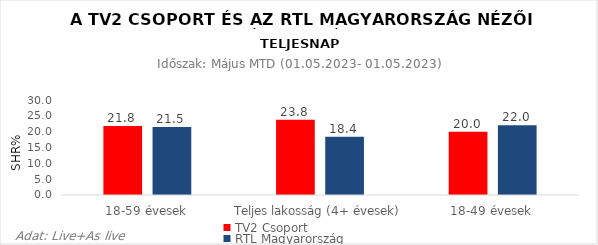
| Category | TV2 Csoport | RTL Magyarország |
|---|---|---|
| 18-59 évesek | 21.8 | 21.5 |
| Teljes lakosság (4+ évesek) | 23.8 | 18.4 |
| 18-49 évesek | 20 | 22 |